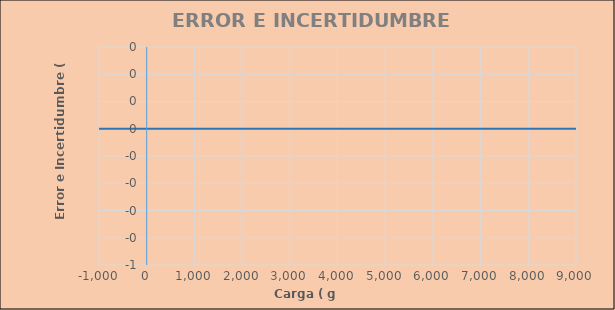
| Category | ERROR (g) |
|---|---|
| #N/A | 0 |
| #N/A | 0 |
| #N/A | 0 |
| #N/A | 0 |
| #N/A | 0 |